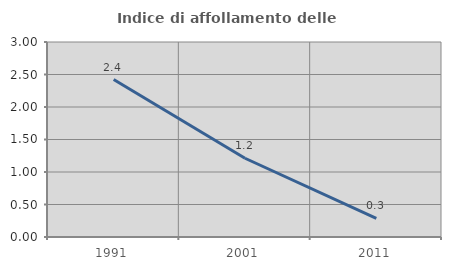
| Category | Indice di affollamento delle abitazioni  |
|---|---|
| 1991.0 | 2.422 |
| 2001.0 | 1.211 |
| 2011.0 | 0.287 |